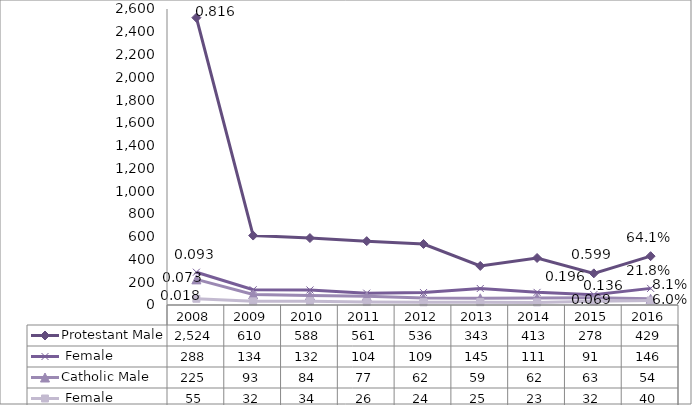
| Category | Protestant | Catholic |
|---|---|---|
| 2008.0 | 288 | 55 |
| 2009.0 | 134 | 32 |
| 2010.0 | 132 | 34 |
| 2011.0 | 104 | 26 |
| 2012.0 | 109 | 24 |
| 2013.0 | 145 | 25 |
| 2014.0 | 111 | 23 |
| 2015.0 | 91 | 32 |
| 2016.0 | 146 | 40 |